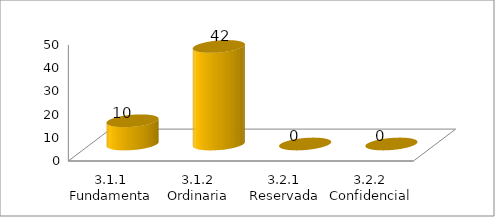
| Category | Series 0 |
|---|---|
| 3.1.1 Fundamental | 10 |
| 3.1.2 Ordinaria | 42 |
| 3.2.1 Reservada | 0 |
| 3.2.2 Confidencial | 0 |